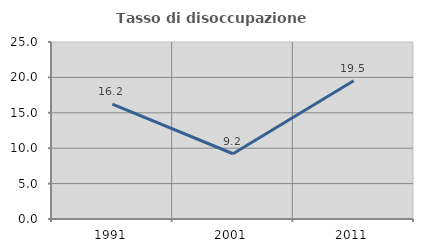
| Category | Tasso di disoccupazione giovanile  |
|---|---|
| 1991.0 | 16.21 |
| 2001.0 | 9.215 |
| 2011.0 | 19.524 |